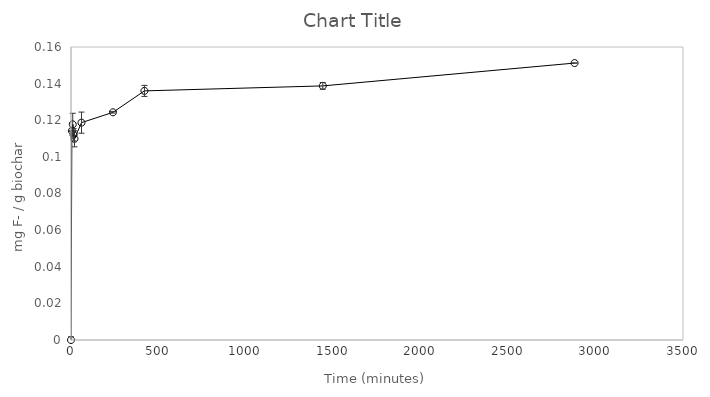
| Category | Series 0 |
|---|---|
| 0.0 | 0 |
| 5.0 | 0.114 |
| 10.0 | 0.118 |
| 15.0 | 0.112 |
| 20.0 | 0.11 |
| 60.0 | 0.119 |
| 240.0 | 0.124 |
| 420.0 | 0.136 |
| 1440.0 | 0.139 |
| 2880.0 | 0.151 |